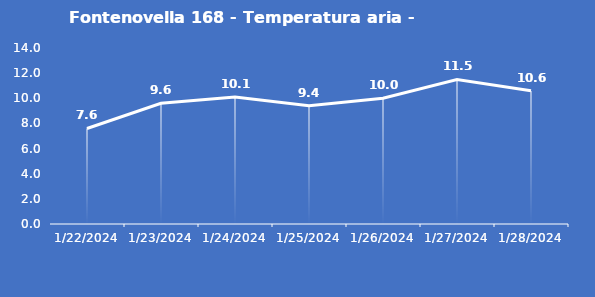
| Category | Fontenovella 168 - Temperatura aria - Grezzo (°C) |
|---|---|
| 1/22/24 | 7.6 |
| 1/23/24 | 9.6 |
| 1/24/24 | 10.1 |
| 1/25/24 | 9.4 |
| 1/26/24 | 10 |
| 1/27/24 | 11.5 |
| 1/28/24 | 10.6 |